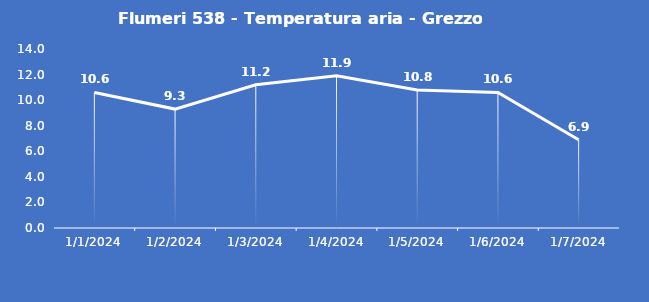
| Category | Flumeri 538 - Temperatura aria - Grezzo (°C) |
|---|---|
| 1/1/24 | 10.6 |
| 1/2/24 | 9.3 |
| 1/3/24 | 11.2 |
| 1/4/24 | 11.9 |
| 1/5/24 | 10.8 |
| 1/6/24 | 10.6 |
| 1/7/24 | 6.9 |